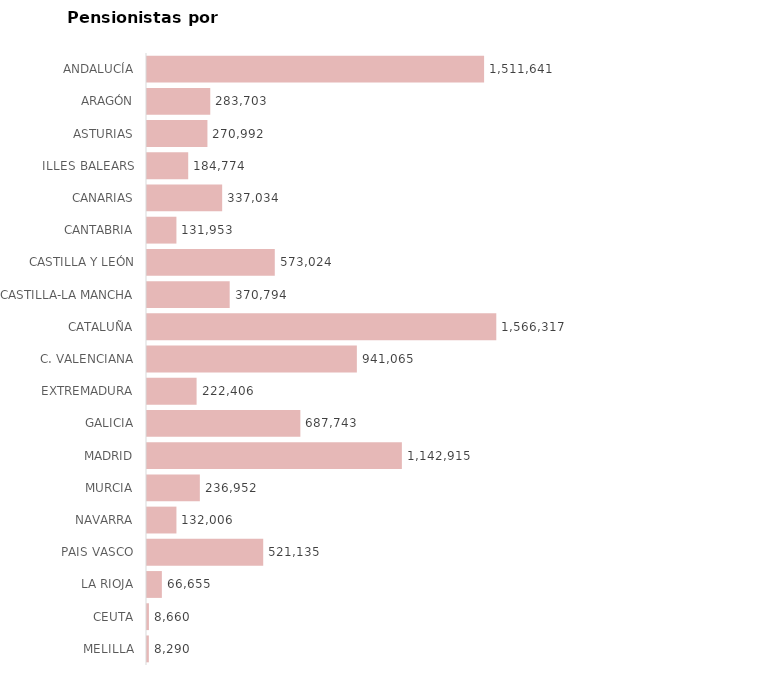
| Category | AMBOS SEXOS (1) |
|---|---|
| ANDALUCÍA | 1511641 |
| ARAGÓN | 283703 |
| ASTURIAS | 270992 |
| ILLES BALEARS | 184774 |
| CANARIAS | 337034 |
| CANTABRIA | 131953 |
| CASTILLA Y LEÓN | 573024 |
| CASTILLA-LA MANCHA | 370794 |
| CATALUÑA | 1566317 |
| C. VALENCIANA | 941065 |
| EXTREMADURA | 222406 |
| GALICIA | 687743 |
| MADRID | 1142915 |
| MURCIA | 236952 |
| NAVARRA | 132006 |
| PAIS VASCO | 521135 |
| LA RIOJA | 66655 |
| CEUTA | 8660 |
| MELILLA | 8290 |